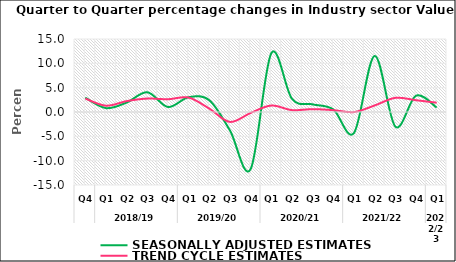
| Category | SEASONALLY ADJUSTED ESTIMATES | TREND CYCLE ESTIMATES |
|---|---|---|
| 0 | 2.936 | 2.759 |
| 1 | 0.799 | 1.295 |
| 2 | 1.94 | 2.236 |
| 3 | 4.057 | 2.759 |
| 4 | 1.028 | 2.621 |
| 5 | 3.043 | 2.965 |
| 6 | 2.407 | 0.689 |
| 7 | -3.81 | -2.036 |
| 8 | -11.724 | -0.185 |
| 9 | 12.09 | 1.329 |
| 10 | 2.706 | 0.386 |
| 11 | 1.565 | 0.589 |
| 12 | 0.524 | 0.378 |
| 13 | -4.304 | -0.013 |
| 14 | 11.524 | 1.342 |
| 15 | -3 | 2.91 |
| 16 | 3.344 | 2.422 |
| 17 | 0.921 | 1.91 |